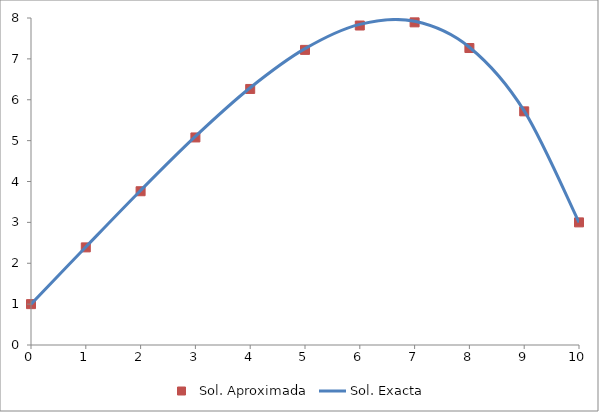
| Category | Sol. Aproximada |
|---|---|
| 0.0 | 1 |
| 1.0 | 2.388 |
| 2.0 | 3.762 |
| 3.0 | 5.078 |
| 4.0 | 6.264 |
| 5.0 | 7.22 |
| 6.0 | 7.816 |
| 7.0 | 7.894 |
| 8.0 | 7.266 |
| 9.0 | 5.716 |
| 10.0 | 3 |